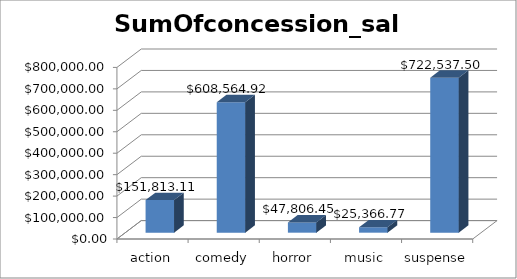
| Category | SumOfconcession_sales |
|---|---|
| action | 151813.115 |
| comedy | 608564.921 |
| horror | 47806.449 |
| music | 25366.771 |
| suspense | 722537.496 |